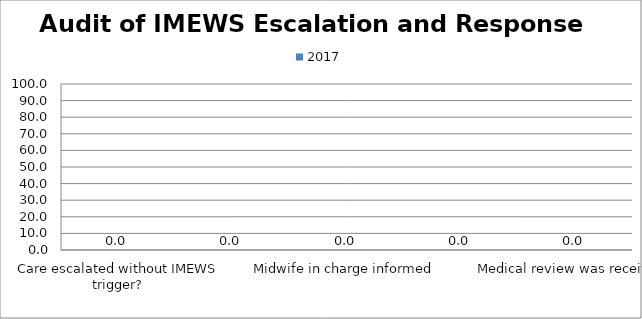
| Category | 2017 |
|---|---|
| Care escalated without IMEWS trigger? | 0 |
| A full set of observations were completed within the required timeframe | 0 |
| Midwife in charge informed | 0 |
| There is evidence that the care was escalated to the appropriate level as per escalation guide | 0 |
| Medical review was received | 0 |